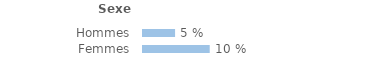
| Category | Series 0 |
|---|---|
| Hommes | 0.049 |
| Femmes | 0.101 |